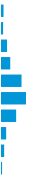
| Category | Series 0 |
|---|---|
| 0 | 0.019 |
| 1 | 0.014 |
| 2 | 0.063 |
| 3 | 0.103 |
| 4 | 0.244 |
| 5 | 0.3 |
| 6 | 0.177 |
| 7 | 0.052 |
| 8 | 0.027 |
| 9 | 0.001 |